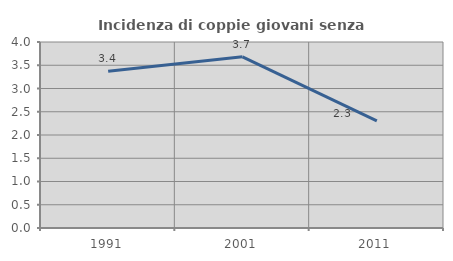
| Category | Incidenza di coppie giovani senza figli |
|---|---|
| 1991.0 | 3.372 |
| 2001.0 | 3.681 |
| 2011.0 | 2.303 |